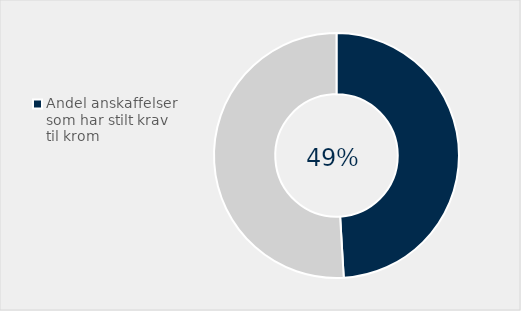
| Category | Series 0 |
|---|---|
| Andel anskaffelser som har stilt krav til krom | 0.491 |
| Ikke stilt krav | 0.509 |